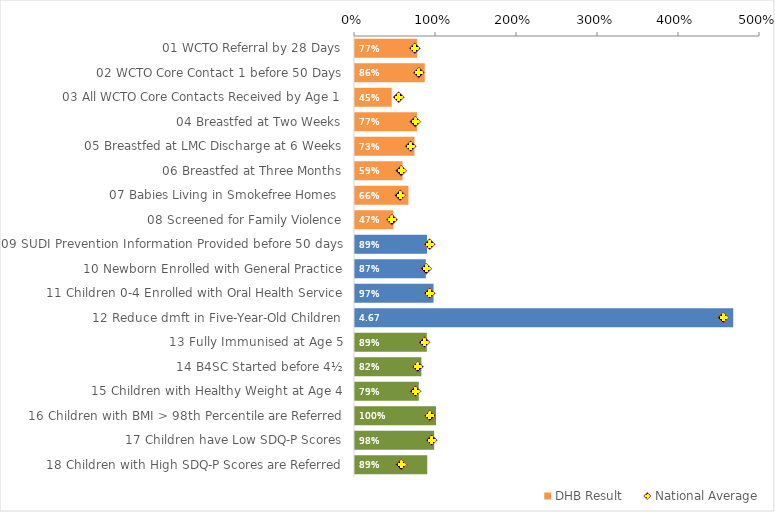
| Category | DHB Result |
|---|---|
| 01 WCTO Referral by 28 Days | 0.767 |
| 02 WCTO Core Contact 1 before 50 Days | 0.861 |
| 03 All WCTO Core Contacts Received by Age 1 | 0.453 |
| 04 Breastfed at Two Weeks | 0.765 |
| 05 Breastfed at LMC Discharge at 6 Weeks | 0.734 |
| 06 Breastfed at Three Months | 0.588 |
| 07 Babies Living in Smokefree Homes  | 0.66 |
| 08 Screened for Family Violence | 0.473 |
| 09 SUDI Prevention Information Provided before 50 days | 0.89 |
| 10 Newborn Enrolled with General Practice | 0.875 |
| 11 Children 0-4 Enrolled with Oral Health Service | 0.97 |
| 12 Reduce dmft in Five-Year-Old Children | 4.669 |
| 13 Fully Immunised at Age 5 | 0.886 |
| 14 B4SC Started before 4½ | 0.819 |
| 15 Children with Healthy Weight at Age 4 | 0.788 |
| 16 Children with BMI > 98th Percentile are Referred | 1 |
| 17 Children have Low SDQ-P Scores | 0.978 |
| 18 Children with High SDQ-P Scores are Referred | 0.892 |